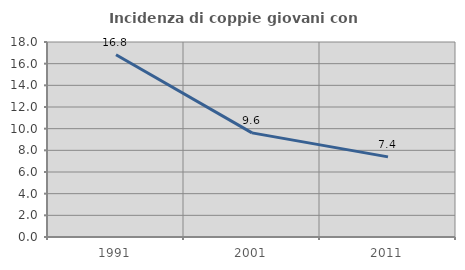
| Category | Incidenza di coppie giovani con figli |
|---|---|
| 1991.0 | 16.819 |
| 2001.0 | 9.61 |
| 2011.0 | 7.397 |